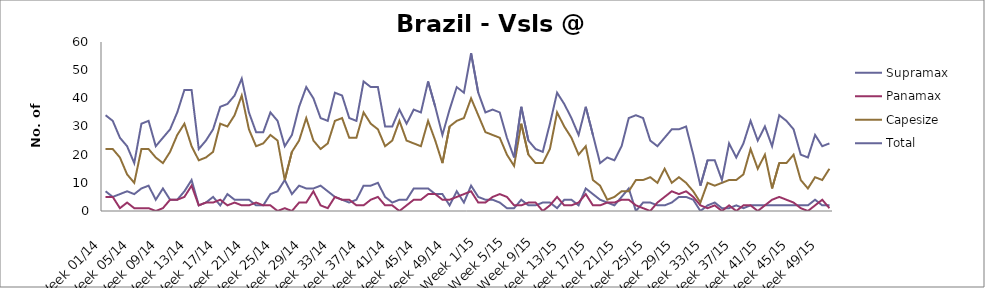
| Category | Supramax | Panamax | Capesize | Total |
|---|---|---|---|---|
| Week 01/14 | 7 | 5 | 22 | 34 |
| Week 02/14 | 5 | 5 | 22 | 32 |
| Week 03/14 | 6 | 1 | 19 | 26 |
| Week 04/14 | 7 | 3 | 13 | 23 |
| Week 05/14 | 6 | 1 | 10 | 17 |
| Week 06/14 | 8 | 1 | 22 | 31 |
| Week 07/14 | 9 | 1 | 22 | 32 |
| Week 08/14 | 4 | 0 | 19 | 23 |
| Week 09/14 | 8 | 1 | 17 | 26 |
| Week 10/14 | 4 | 4 | 21 | 29 |
| Week 11/14 | 4 | 4 | 27 | 35 |
| Week 12/14 | 7 | 5 | 31 | 43 |
| Week 13/14 | 11 | 9 | 23 | 43 |
| Week 14/14 | 2 | 2 | 18 | 22 |
| Week 15/14 | 3 | 3 | 19 | 25 |
| Week 16/14 | 5 | 3 | 21 | 29 |
| Week 17/14 | 2 | 4 | 31 | 37 |
| Week 18/14 | 6 | 2 | 30 | 38 |
| Week 19/14 | 4 | 3 | 34 | 41 |
| Week 20/14 | 4 | 2 | 41 | 47 |
| Week 21/14 | 4 | 2 | 29 | 35 |
| Week 22/14 | 2 | 3 | 23 | 28 |
| Week 23/14 | 2 | 2 | 24 | 28 |
| Week 24/14 | 6 | 2 | 27 | 35 |
| Week 25/14 | 7 | 0 | 25 | 32 |
| Week 26/14 | 11 | 1 | 11 | 23 |
| Week 27/14 | 6 | 0 | 21 | 27 |
| Week 28/14 | 9 | 3 | 25 | 37 |
| Week 29/14 | 8 | 3 | 33 | 44 |
| Week 30/14 | 8 | 7 | 25 | 40 |
| Week 31/14 | 9 | 2 | 22 | 33 |
| Week 32/14 | 7 | 1 | 24 | 32 |
| Week 33/14 | 5 | 5 | 32 | 42 |
| Week 34/14 | 4 | 4 | 33 | 41 |
| Week 35/14 | 3 | 4 | 26 | 33 |
| Week 36/14 | 4 | 2 | 26 | 32 |
| Week 37/14 | 9 | 2 | 35 | 46 |
| Week 38/14 | 9 | 4 | 31 | 44 |
| Week 39/14 | 10 | 5 | 29 | 44 |
| Week 40/14 | 5 | 2 | 23 | 30 |
| Week 41/14 | 3 | 2 | 25 | 30 |
| Week 42/14 | 4 | 0 | 32 | 36 |
| Week 43/14 | 4 | 2 | 25 | 31 |
| Week 44/14 | 8 | 4 | 24 | 36 |
| Week 45/14 | 8 | 4 | 23 | 35 |
| Week 46/14 | 8 | 6 | 32 | 46 |
| Week 47/14 | 6 | 6 | 25 | 37 |
| Week 48/14 | 6 | 4 | 17 | 27 |
| Week 49/14 | 2 | 4 | 30 | 36 |
| Week 50/14 | 7 | 5 | 32 | 44 |
| Week 51/14 | 3 | 6 | 33 | 42 |
| Week 52/14 | 9 | 7 | 40 | 56 |
| Week 1/15 | 5 | 3 | 34 | 42 |
| Week 2/15 | 4 | 3 | 28 | 35 |
| Week 3/15 | 4 | 5 | 27 | 36 |
| Week 4/15 | 3 | 6 | 26 | 35 |
| Week 5/15 | 1 | 5 | 20 | 26 |
| Week 6/15 | 1 | 2 | 16 | 19 |
| Week 7/15 | 4 | 2 | 31 | 37 |
| Week 8/15 | 2 | 3 | 20 | 25 |
| Week 9/15 | 2 | 3 | 17 | 22 |
| Week 10/15 | 3 | 0 | 17 | 21 |
| Week 11/15 | 3 | 2 | 22 | 31 |
| Week 12/15 | 1 | 5 | 35 | 42 |
| Week 13/15 | 4 | 2 | 30 | 38 |
| Week 14/15 | 4 | 2 | 26 | 33 |
| Week 15/15 | 2 | 3 | 20 | 27 |
| Week 16/15 | 8 | 6 | 23 | 37 |
| Week 17/15 | 6 | 2 | 11 | 27 |
| Week 18/15 | 4 | 2 | 9 | 17 |
| Week 19/15 | 3 | 3 | 4 | 19 |
| Week 20/15 | 2 | 3 | 5 | 18 |
| Week 21/15 | 5 | 4 | 7 | 23 |
| Week 22/15 | 8 | 4 | 7 | 33 |
| Week 23/15 | 0 | 2 | 11 | 34 |
| Week 24/15 | 3 | 1 | 11 | 33 |
| Week 25/15 | 3 | 0 | 12 | 25 |
| Week 26/15 | 2 | 3 | 10 | 23 |
| Week 27/15 | 2 | 5 | 15 | 26 |
| Week 28/15 | 3 | 7 | 10 | 29 |
| Week 29/15 | 5 | 6 | 12 | 29 |
| Week 30/15 | 5 | 7 | 10 | 30 |
| Week 31/15 | 4 | 5 | 7 | 20 |
| Week 32/15 | 0 | 2 | 3 | 9 |
| Week 33/15 | 2 | 1 | 10 | 18 |
| Week 34/15 | 3 | 2 | 9 | 18 |
| Week 35/15 | 1 | 0 | 10 | 11 |
| Week 36/15 | 1 | 2 | 11 | 24 |
| Week 37/15 | 2 | 0 | 11 | 19 |
| Week 38/15 | 1 | 2 | 13 | 24 |
| Week 39/15 | 2 | 2 | 22 | 32 |
| Week 40/15 | 2 | 0 | 15 | 25 |
| Week 41/15 | 2 | 2 | 20 | 30 |
| Week 42/15 | 2 | 4 | 8 | 23 |
| Week 43/15 | 2 | 5 | 17 | 34 |
| Week 44/15 | 2 | 4 | 17 | 32 |
| Week 45/15 | 2 | 3 | 20 | 29 |
| Week 46/15 | 2 | 1 | 11 | 20 |
| Week 47/15 | 2 | 0 | 8 | 19 |
| Week 48/15 | 4 | 2 | 12 | 27 |
| Week 49/15 | 2 | 4 | 11 | 23 |
| Week 50/15 | 2 | 1 | 15 | 24 |